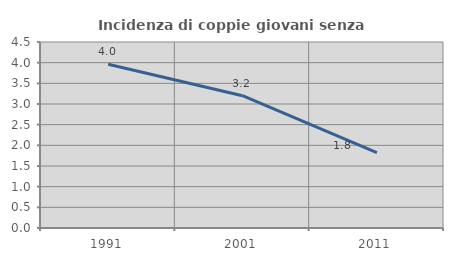
| Category | Incidenza di coppie giovani senza figli |
|---|---|
| 1991.0 | 3.96 |
| 2001.0 | 3.201 |
| 2011.0 | 1.823 |